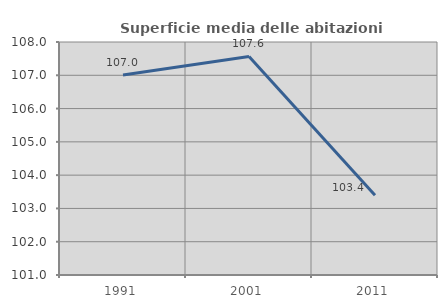
| Category | Superficie media delle abitazioni occupate |
|---|---|
| 1991.0 | 107.011 |
| 2001.0 | 107.566 |
| 2011.0 | 103.399 |